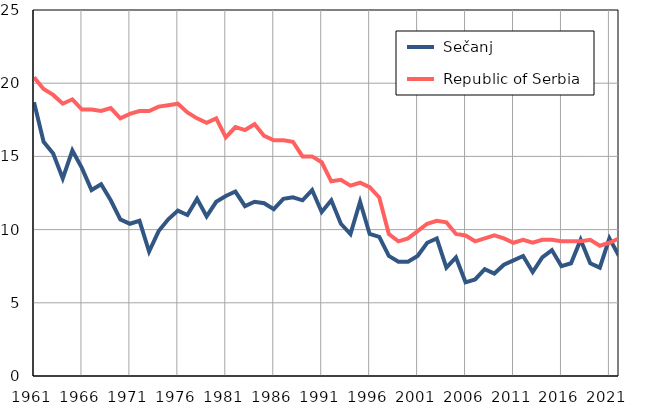
| Category |  Sečanj |  Republic of Serbia |
|---|---|---|
| 1961.0 | 18.7 | 20.4 |
| 1962.0 | 16 | 19.6 |
| 1963.0 | 15.2 | 19.2 |
| 1964.0 | 13.5 | 18.6 |
| 1965.0 | 15.4 | 18.9 |
| 1966.0 | 14.2 | 18.2 |
| 1967.0 | 12.7 | 18.2 |
| 1968.0 | 13.1 | 18.1 |
| 1969.0 | 12 | 18.3 |
| 1970.0 | 10.7 | 17.6 |
| 1971.0 | 10.4 | 17.9 |
| 1972.0 | 10.6 | 18.1 |
| 1973.0 | 8.5 | 18.1 |
| 1974.0 | 9.9 | 18.4 |
| 1975.0 | 10.7 | 18.5 |
| 1976.0 | 11.3 | 18.6 |
| 1977.0 | 11 | 18 |
| 1978.0 | 12.1 | 17.6 |
| 1979.0 | 10.9 | 17.3 |
| 1980.0 | 11.9 | 17.6 |
| 1981.0 | 12.3 | 16.3 |
| 1982.0 | 12.6 | 17 |
| 1983.0 | 11.6 | 16.8 |
| 1984.0 | 11.9 | 17.2 |
| 1985.0 | 11.8 | 16.4 |
| 1986.0 | 11.4 | 16.1 |
| 1987.0 | 12.1 | 16.1 |
| 1988.0 | 12.2 | 16 |
| 1989.0 | 12 | 15 |
| 1990.0 | 12.7 | 15 |
| 1991.0 | 11.2 | 14.6 |
| 1992.0 | 12 | 13.3 |
| 1993.0 | 10.4 | 13.4 |
| 1994.0 | 9.7 | 13 |
| 1995.0 | 11.9 | 13.2 |
| 1996.0 | 9.7 | 12.9 |
| 1997.0 | 9.5 | 12.2 |
| 1998.0 | 8.2 | 9.7 |
| 1999.0 | 7.8 | 9.2 |
| 2000.0 | 7.8 | 9.4 |
| 2001.0 | 8.2 | 9.9 |
| 2002.0 | 9.1 | 10.4 |
| 2003.0 | 9.4 | 10.6 |
| 2004.0 | 7.4 | 10.5 |
| 2005.0 | 8.1 | 9.7 |
| 2006.0 | 6.4 | 9.6 |
| 2007.0 | 6.6 | 9.2 |
| 2008.0 | 7.3 | 9.4 |
| 2009.0 | 7 | 9.6 |
| 2010.0 | 7.6 | 9.4 |
| 2011.0 | 7.9 | 9.1 |
| 2012.0 | 8.2 | 9.3 |
| 2013.0 | 7.1 | 9.1 |
| 2014.0 | 8.1 | 9.3 |
| 2015.0 | 8.6 | 9.3 |
| 2016.0 | 7.5 | 9.2 |
| 2017.0 | 7.7 | 9.2 |
| 2018.0 | 9.3 | 9.2 |
| 2019.0 | 7.7 | 9.3 |
| 2020.0 | 7.4 | 8.9 |
| 2021.0 | 9.4 | 9.1 |
| 2022.0 | 8.2 | 9.4 |